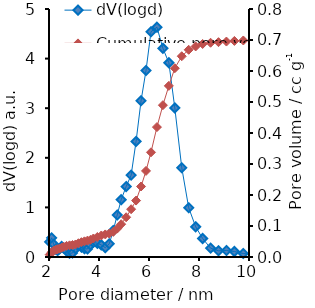
| Category | dV(logd) |
|---|---|
| 1.379 | 0 |
| 1.432 | 0 |
| 1.498 | 0 |
| 1.564 | 0 |
| 1.631 | 0 |
| 1.697 | 0 |
| 1.78 | 0 |
| 1.868 | 0 |
| 1.948 | 0.08 |
| 2.027 | 0.305 |
| 2.107 | 0.386 |
| 2.186 | 0.256 |
| 2.266 | 0.159 |
| 2.345 | 0.13 |
| 2.425 | 0.163 |
| 2.504 | 0.213 |
| 2.583 | 0.183 |
| 2.703 | 0.121 |
| 2.822 | 0.075 |
| 2.941 | 0.08 |
| 3.06 | 0.17 |
| 3.179 | 0.225 |
| 3.298 | 0.196 |
| 3.418 | 0.166 |
| 3.537 | 0.161 |
| 3.656 | 0.244 |
| 3.775 | 0.294 |
| 3.934 | 0.276 |
| 4.093 | 0.243 |
| 4.252 | 0.188 |
| 4.411 | 0.266 |
| 4.57 | 0.533 |
| 4.728 | 0.847 |
| 4.887 | 1.155 |
| 5.086 | 1.421 |
| 5.285 | 1.65 |
| 5.483 | 2.33 |
| 5.682 | 3.15 |
| 5.88 | 3.76 |
| 6.079 | 4.541 |
| 6.317 | 4.633 |
| 6.556 | 4.208 |
| 6.794 | 3.916 |
| 7.032 | 3.006 |
| 7.31 | 1.8 |
| 7.588 | 0.992 |
| 7.867 | 0.609 |
| 8.145 | 0.373 |
| 8.462 | 0.179 |
| 8.78 | 0.125 |
| 9.098 | 0.131 |
| 9.416 | 0.111 |
| 9.773 | 0.07 |
| 10.131 | 0.051 |
| 10.488 | 0.044 |
| 10.885 | 0.032 |
| 11.283 | 0.027 |
| 11.68 | 0.029 |
| 12.117 | 0.036 |
| 12.554 | 0.043 |
| 12.991 | 0.039 |
| 13.467 | 0.037 |
| 13.944 | 0.037 |
| 14.46 | 0.031 |
| 14.977 | 0.029 |
| 15.533 | 0.029 |
| 16.089 | 0.03 |
| 16.685 | 0.029 |
| 17.281 | 0.026 |
| 17.916 | 0.021 |
| 18.552 | 0.017 |
| 19.227 | 0.022 |
| 19.902 | 0.024 |
| 20.617 | 0.019 |
| 21.372 | 0.018 |
| 22.127 | 0.019 |
| 22.921 | 0.019 |
| 23.755 | 0.018 |
| 24.629 | 0.013 |
| 25.503 | 0.01 |
| 26.417 | 0.01 |
| 27.37 | 0.011 |
| 28.363 | 0.011 |
| 29.396 | 0.009 |
| 30.468 | 0.008 |
| 31.541 | 0.009 |
| 32.653 | 0.008 |
| 33.805 | 0.008 |
| 34.997 | 0.011 |
| 36.228 | 0.013 |